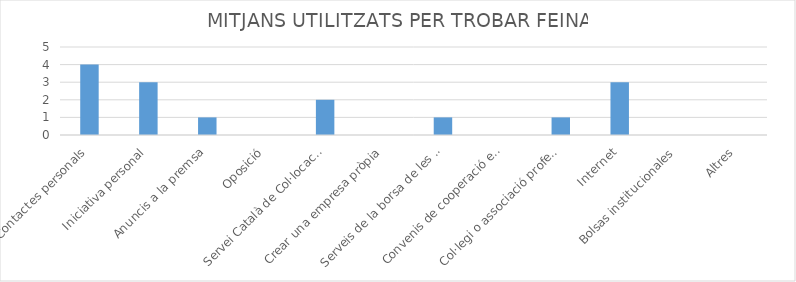
| Category | Series 0 |
|---|---|
| Contactes personals | 4 |
| Iniciativa personal | 3 |
| Anuncis a la premsa | 1 |
| Oposició | 0 |
| Servei Català de Col·locació | 2 |
| Crear una empresa pròpia | 0 |
| Serveis de la borsa de les universitats | 1 |
| Convenis de cooperació educativa | 0 |
| Col·legi o associació professional | 1 |
| Internet | 3 |
| Bolsas institucionales | 0 |
| Altres | 0 |